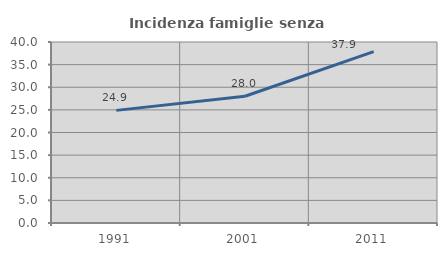
| Category | Incidenza famiglie senza nuclei |
|---|---|
| 1991.0 | 24.889 |
| 2001.0 | 28.018 |
| 2011.0 | 37.877 |